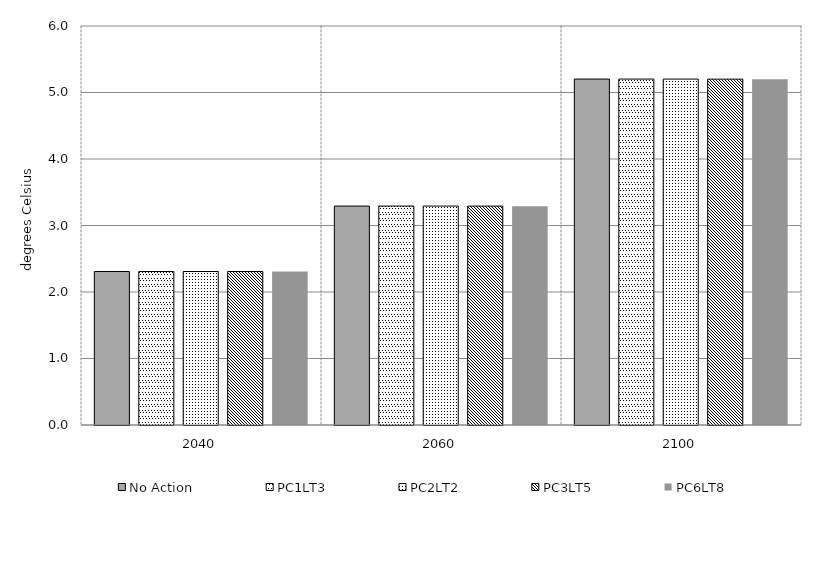
| Category | No Action | PC1LT3 | PC2LT2 | PC3LT5 | PC6LT8 | Alt 5 | Alt 6 | Alt 7 | Alt 8 | Alt 10 |
|---|---|---|---|---|---|---|---|---|---|---|
| 2040.0 | 2.308 | 2.308 | 2.308 | 2.308 | 2.307 |  |  |  |  |  |
| 2060.0 | 3.292 | 3.292 | 3.292 | 3.292 | 3.29 |  |  |  |  |  |
| 2100.0 | 5.202 | 5.202 | 5.202 | 5.201 | 5.198 |  |  |  |  |  |